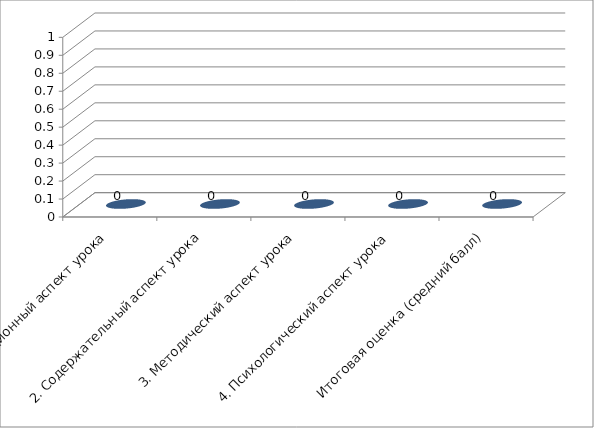
| Category | Series 0 |
|---|---|
| 1. Организационный аспект урока | 0 |
| 2. Содержательный аспект урока | 0 |
| 3. Методический аспект урока | 0 |
|  4. Психологический аспект урока | 0 |
| Итоговая оценка (средний балл) | 0 |